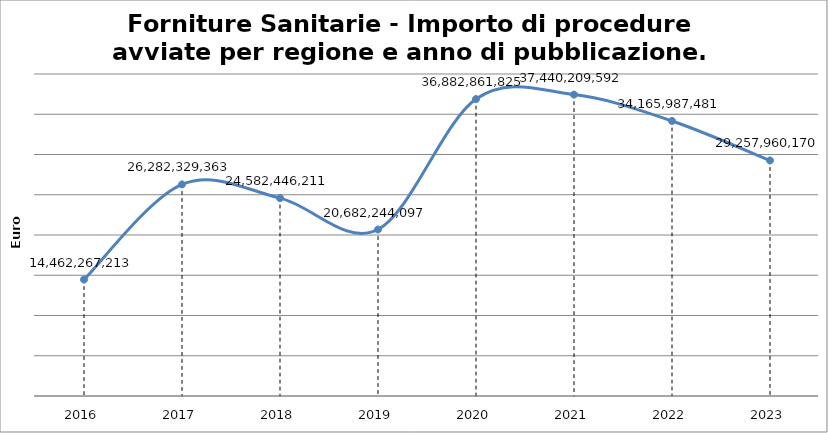
| Category | Totale |
|---|---|
| 2016.0 | 14462267213 |
| 2017.0 | 26282329363 |
| 2018.0 | 24582446211 |
| 2019.0 | 20682244097 |
| 2020.0 | 36882861825 |
| 2021.0 | 37440209592 |
| 2022.0 | 34165987481 |
| 2023.0 | 29257960170 |